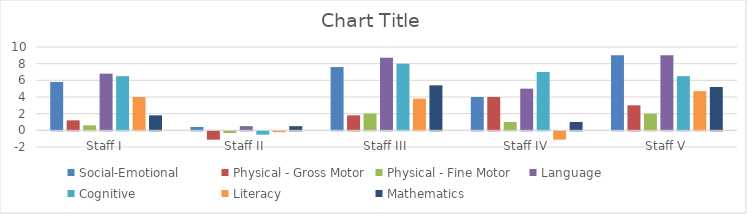
| Category | Social-Emotional | Physical - Gross Motor | Physical - Fine Motor | Language | Cognitive | Literacy | Mathematics |
|---|---|---|---|---|---|---|---|
| Staff I | 5.8 | 1.2 | 0.6 | 6.8 | 6.5 | 4 | 1.8 |
| Staff II | 0.4 | -1 | -0.2 | 0.5 | -0.4 | -0.1 | 0.5 |
| Staff III | 7.6 | 1.8 | 2 | 8.7 | 8 | 3.8 | 5.4 |
| Staff IV | 4 | 4 | 1 | 5 | 7 | -1 | 1 |
| Staff V | 9 | 3 | 2 | 9 | 6.5 | 4.7 | 5.2 |